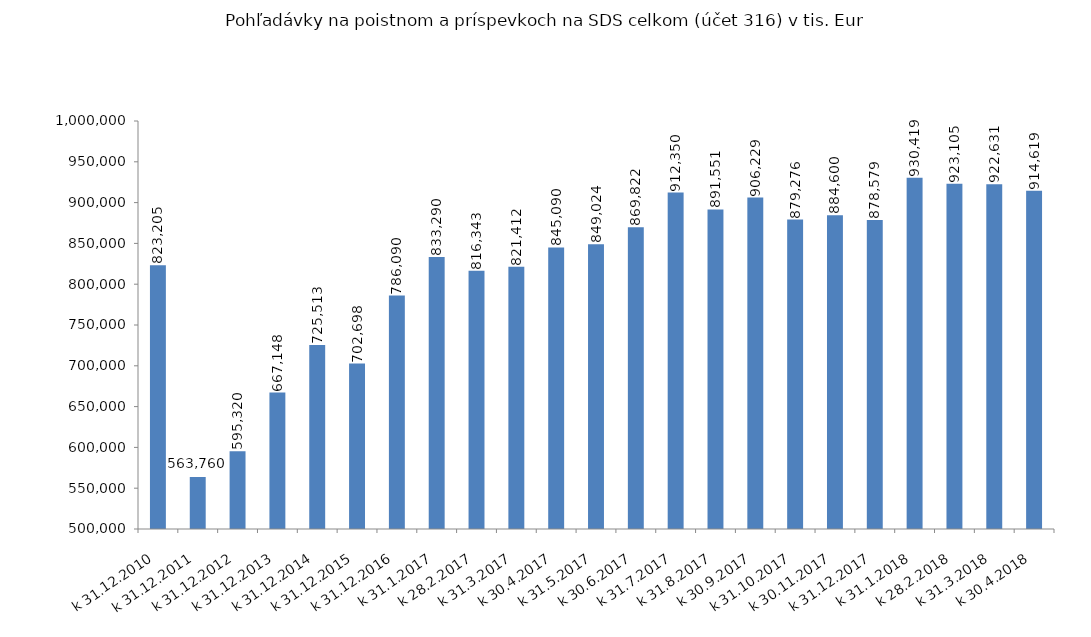
| Category | Series 0 |
|---|---|
| k 31.12.2010 | 823205 |
|  k 31.12.2011 | 563760.215 |
| k 31.12.2012 | 595319.52 |
| k 31.12.2013 | 667147.854 |
| k 31.12.2014 | 725513.4 |
| k 31.12.2015 | 702697.806 |
| k 31.12.2016 | 786089.718 |
| k 31.1.2017 | 833289.917 |
| k 28.2.2017 | 816343.107 |
| k 31.3.2017 | 821412.017 |
| k 30.4.2017 | 845090.125 |
| k 31.5.2017 | 849024.445 |
| k 30.6.2017 | 869821.809 |
| k 31.7.2017 | 912350.357 |
| k 31.8.2017 | 891550.985 |
| k 30.9.2017 | 906229.174 |
| k 31.10.2017 | 879275.778 |
| k 30.11.2017 | 884599.516 |
| k 31.12.2017 | 878579.466 |
| k 31.1.2018 | 930418.846 |
| k 28.2.2018 | 923104.813 |
| k 31.3.2018 | 922631.174 |
| k 30.4.2018 | 914619.475 |